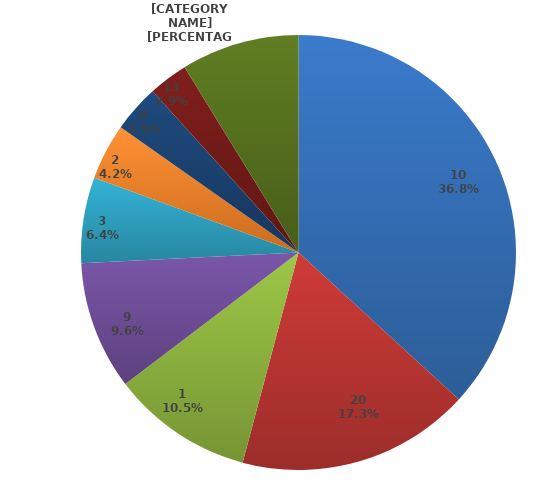
| Category | Series 0 |
|---|---|
| 10 | 36649472.88 |
| 20 | 17256166.19 |
| 1 | 10476064.29 |
| 9 | 9508916.83 |
| 3 | 6345858.77 |
| 2 | 4161909.44 |
| 8 | 3512163.46 |
| 13 | 2927417.99 |
|  Ostalo (manje od 3%)/
Others (less than 3%) | 8732488.63 |